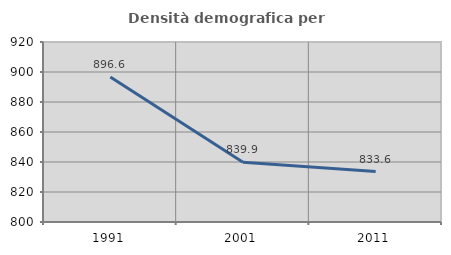
| Category | Densità demografica |
|---|---|
| 1991.0 | 896.6 |
| 2001.0 | 839.862 |
| 2011.0 | 833.647 |